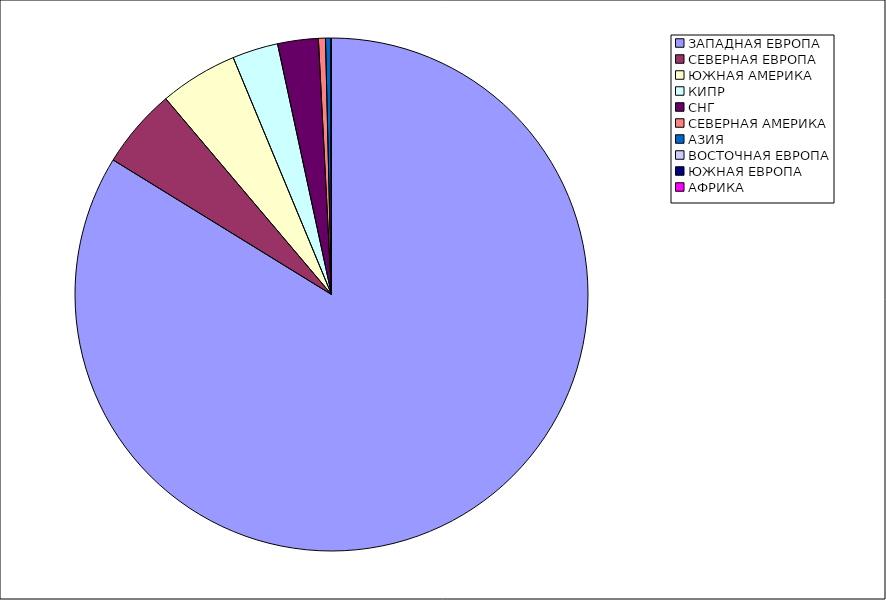
| Category | Оборот |
|---|---|
| ЗАПАДНАЯ ЕВРОПА | 0.838 |
| СЕВЕРНАЯ ЕВРОПА | 0.05 |
| ЮЖНАЯ АМЕРИКА | 0.049 |
| КИПР | 0.029 |
| СНГ | 0.026 |
| СЕВЕРНАЯ АМЕРИКА | 0.004 |
| АЗИЯ | 0.003 |
| ВОСТОЧНАЯ ЕВРОПА | 0 |
| ЮЖНАЯ ЕВРОПА | 0 |
| АФРИКА | 0 |